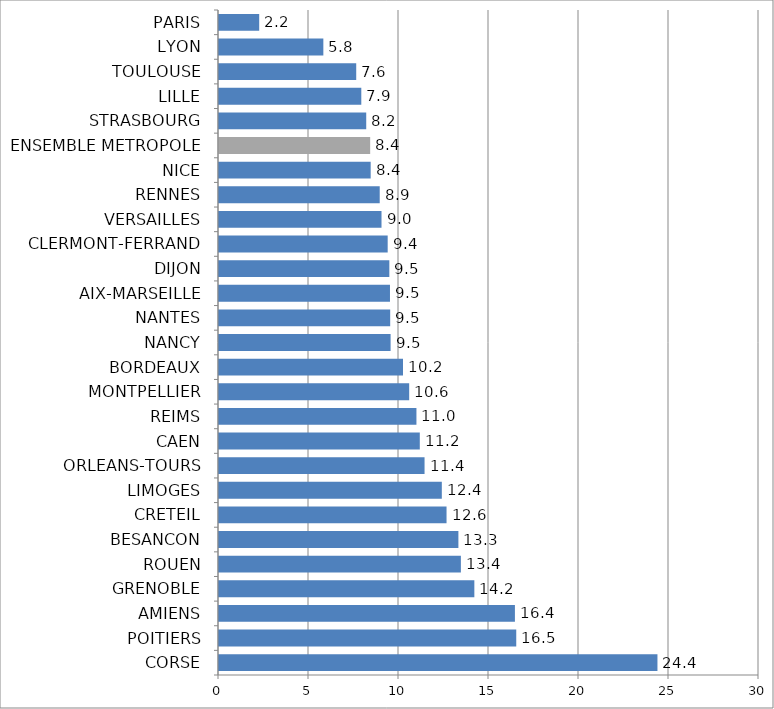
| Category | Series 0 |
|---|---|
| CORSE | 24.358 |
| POITIERS | 16.514 |
| AMIENS | 16.44 |
| GRENOBLE | 14.186 |
| ROUEN | 13.438 |
| BESANCON | 13.3 |
| CRETEIL | 12.641 |
| LIMOGES | 12.379 |
| ORLEANS-TOURS | 11.42 |
| CAEN | 11.156 |
| REIMS | 10.969 |
| MONTPELLIER | 10.566 |
| BORDEAUX | 10.222 |
| NANCY | 9.533 |
| NANTES | 9.511 |
| AIX-MARSEILLE | 9.499 |
| DIJON | 9.463 |
| CLERMONT-FERRAND | 9.371 |
| VERSAILLES | 9.028 |
| RENNES | 8.929 |
| NICE | 8.426 |
| ENSEMBLE METROPOLE | 8.399 |
| STRASBOURG | 8.179 |
| LILLE | 7.906 |
| TOULOUSE | 7.623 |
| LYON | 5.797 |
| PARIS | 2.233 |